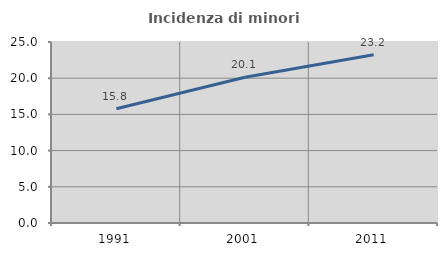
| Category | Incidenza di minori stranieri |
|---|---|
| 1991.0 | 15.789 |
| 2001.0 | 20.139 |
| 2011.0 | 23.244 |